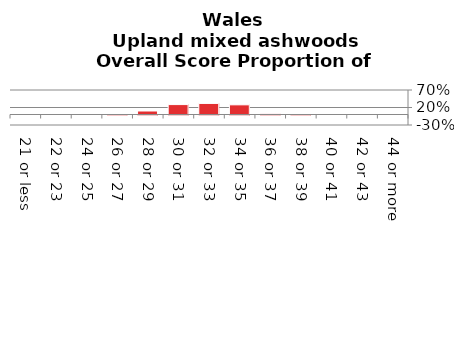
| Category | Upland mixed ashwoods |
|---|---|
| 21 or less | 0 |
| 22 or 23 | 0 |
| 24 or 25 | 0 |
| 26 or 27 | 0.002 |
| 28 or 29 | 0.1 |
| 30 or 31 | 0.283 |
| 32 or 33 | 0.317 |
| 34 or 35 | 0.276 |
| 36 or 37 | 0.019 |
| 38 or 39 | 0.003 |
| 40 or 41 | 0 |
| 42 or 43 | 0 |
| 44 or more | 0 |